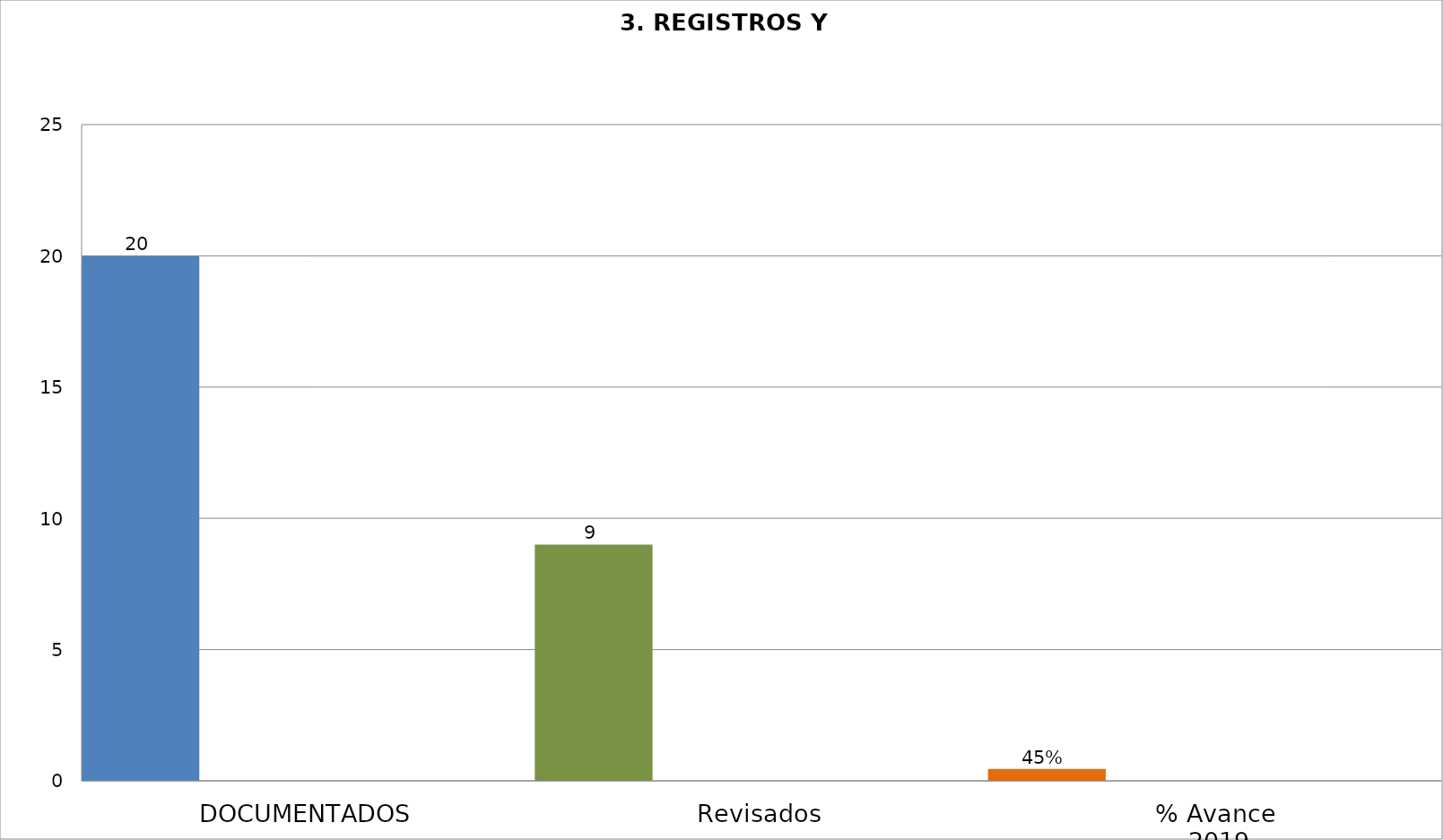
| Category | Series 2 | Series 3 | Series 4 | Series 0 | Series 1 | Series 5 | Series 6 | Series 7 | Series 8 | Series 9 | Series 10 | Series 11 | Series 12 | Series 13 | Series 14 | Series 15 | Series 16 | Series 17 | Series 18 | Series 19 |
|---|---|---|---|---|---|---|---|---|---|---|---|---|---|---|---|---|---|---|---|---|
| DOCUMENTADOS | 20 |  |  |  |  |  |  |  |  |  |  |  |  |  |  |  |  |  |  |  |
| Revisados | 9 |  |  |  |  |  |  |  |  |  |  |  |  |  |  |  |  |  |  |  |
| % Avance
 2019 | 0.45 |  |  |  |  |  |  |  |  |  |  |  |  |  |  |  |  |  |  |  |